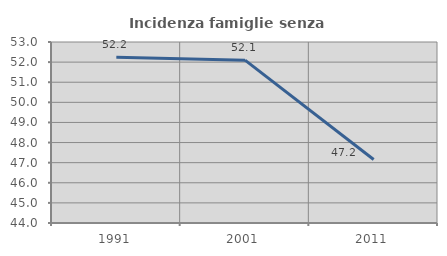
| Category | Incidenza famiglie senza nuclei |
|---|---|
| 1991.0 | 52.247 |
| 2001.0 | 52.096 |
| 2011.0 | 47.159 |